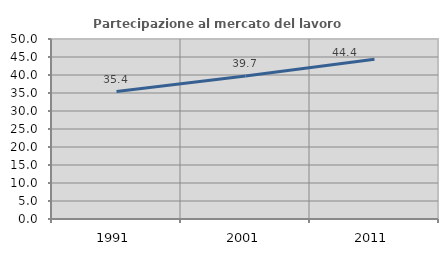
| Category | Partecipazione al mercato del lavoro  femminile |
|---|---|
| 1991.0 | 35.412 |
| 2001.0 | 39.702 |
| 2011.0 | 44.356 |